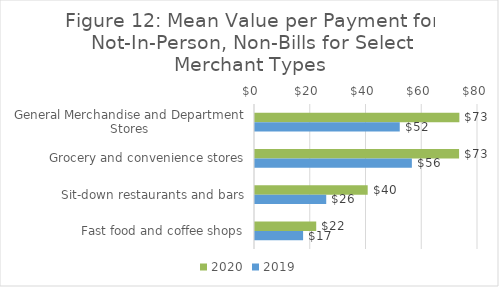
| Category | 2020 | 2019 |
|---|---|---|
| General Merchandise and Department Stores | 73.315 | 51.927 |
| Grocery and convenience stores | 73.209 | 56.276 |
| Sit-down restaurants and bars | 40.425 | 25.552 |
| Fast food and coffee shops | 21.963 | 17.256 |